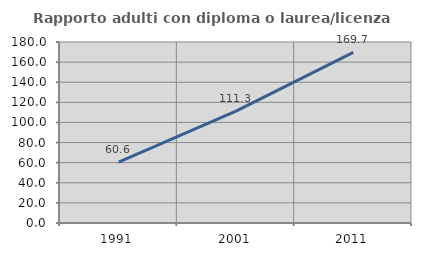
| Category | Rapporto adulti con diploma o laurea/licenza media  |
|---|---|
| 1991.0 | 60.606 |
| 2001.0 | 111.268 |
| 2011.0 | 169.697 |